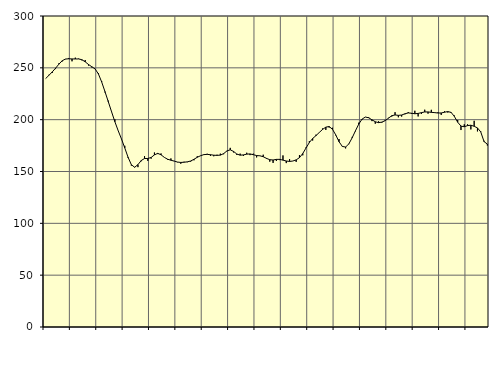
| Category | Piggar | Series 1 |
|---|---|---|
| nan | 239.7 | 239.65 |
| 87.0 | 243.3 | 242.8 |
| 87.0 | 245.1 | 246.07 |
| 87.0 | 248.8 | 249.6 |
| nan | 254.3 | 253.47 |
| 88.0 | 256.1 | 256.8 |
| 88.0 | 258.3 | 258.48 |
| 88.0 | 259.5 | 258.73 |
| nan | 256.3 | 258.58 |
| 89.0 | 259.8 | 258.54 |
| 89.0 | 258.9 | 258.57 |
| 89.0 | 257.2 | 257.83 |
| nan | 257.5 | 255.8 |
| 90.0 | 252.2 | 253.21 |
| 90.0 | 250.4 | 251.1 |
| 90.0 | 249 | 248.9 |
| nan | 244.9 | 244.19 |
| 91.0 | 237.2 | 236.37 |
| 91.0 | 226.3 | 227.07 |
| 91.0 | 218.3 | 217.39 |
| nan | 208 | 207.63 |
| 92.0 | 200.3 | 198.05 |
| 92.0 | 189.3 | 189.4 |
| 92.0 | 181.3 | 181.42 |
| nan | 174.8 | 172.77 |
| 93.0 | 163.1 | 163.76 |
| 93.0 | 155.7 | 156.57 |
| 93.0 | 154.4 | 154.07 |
| nan | 154.2 | 156.63 |
| 94.0 | 159.9 | 160.62 |
| 94.0 | 164.8 | 162.52 |
| 94.0 | 160.3 | 162.56 |
| nan | 162.4 | 163.52 |
| 95.0 | 168.3 | 166.03 |
| 95.0 | 166.8 | 167.49 |
| 95.0 | 167.4 | 166.12 |
| nan | 163.7 | 163.63 |
| 96.0 | 161.3 | 161.84 |
| 96.0 | 162.6 | 160.87 |
| 96.0 | 160.2 | 160.03 |
| nan | 158.9 | 159.11 |
| 97.0 | 157.5 | 158.73 |
| 97.0 | 159.4 | 158.95 |
| 97.0 | 159 | 159.32 |
| nan | 159.6 | 160.12 |
| 98.0 | 160.8 | 161.78 |
| 98.0 | 164.7 | 163.71 |
| 98.0 | 165.1 | 165.22 |
| nan | 166.5 | 166.29 |
| 99.0 | 167.1 | 166.52 |
| 99.0 | 165.1 | 166.19 |
| 99.0 | 164.7 | 165.73 |
| nan | 166.2 | 165.56 |
| 0.0 | 167.2 | 165.79 |
| 0.0 | 166.7 | 167.25 |
| 0.0 | 169.6 | 169.86 |
| nan | 172.8 | 170.91 |
| 1.0 | 168.4 | 169.36 |
| 1.0 | 166 | 166.88 |
| 1.0 | 167.2 | 165.74 |
| nan | 165 | 166.01 |
| 2.0 | 168.1 | 166.73 |
| 2.0 | 165.8 | 166.95 |
| 2.0 | 167.2 | 166.2 |
| nan | 163.6 | 165.4 |
| 3.0 | 165 | 165.14 |
| 3.0 | 166.2 | 164.27 |
| 3.0 | 162.2 | 162.65 |
| nan | 159.5 | 161.38 |
| 4.0 | 158.3 | 161.1 |
| 4.0 | 160.2 | 161.69 |
| 4.0 | 161 | 161.72 |
| nan | 165.5 | 160.95 |
| 5.0 | 158.1 | 160.13 |
| 5.0 | 162 | 159.7 |
| 5.0 | 160.1 | 160.11 |
| nan | 159.3 | 161.24 |
| 6.0 | 165.8 | 163.33 |
| 6.0 | 165.6 | 167.36 |
| 6.0 | 173.3 | 172.71 |
| nan | 179.3 | 177.95 |
| 7.0 | 179.9 | 181.82 |
| 7.0 | 185.5 | 184.58 |
| 7.0 | 187.5 | 187.61 |
| nan | 191.5 | 190.58 |
| 8.0 | 190.1 | 192.79 |
| 8.0 | 192.4 | 193.4 |
| 8.0 | 192.2 | 190.78 |
| nan | 184.9 | 185.36 |
| 9.0 | 181.3 | 178.74 |
| 9.0 | 173.9 | 174.18 |
| 9.0 | 172.3 | 173.58 |
| nan | 176.4 | 176.76 |
| 10.0 | 183.4 | 182.59 |
| 10.0 | 188.8 | 189.38 |
| 10.0 | 197.1 | 195.77 |
| nan | 200.1 | 200.58 |
| 11.0 | 202.6 | 202.54 |
| 11.0 | 202.4 | 201.81 |
| 11.0 | 198.6 | 199.88 |
| nan | 196.1 | 197.98 |
| 12.0 | 198.4 | 197.13 |
| 12.0 | 197.1 | 197.63 |
| 12.0 | 199.8 | 199.04 |
| nan | 201.8 | 201.42 |
| 13.0 | 203 | 203.8 |
| 13.0 | 207.2 | 204.55 |
| 13.0 | 202.3 | 204.16 |
| nan | 203 | 204.48 |
| 14.0 | 205.2 | 205.68 |
| 14.0 | 207.3 | 206.5 |
| 14.0 | 205.6 | 206.19 |
| nan | 208.6 | 205.7 |
| 15.0 | 203.1 | 206.03 |
| 15.0 | 205.5 | 206.77 |
| 15.0 | 209.6 | 207.45 |
| nan | 205.8 | 207.45 |
| 16.0 | 209.5 | 207.05 |
| 16.0 | 207.1 | 206.8 |
| 16.0 | 207.1 | 206.41 |
| nan | 204.6 | 206.47 |
| 17.0 | 208.1 | 207.17 |
| 17.0 | 206.9 | 207.81 |
| 17.0 | 206.5 | 207.03 |
| nan | 204 | 203.1 |
| 18.0 | 199.7 | 197.54 |
| 18.0 | 190 | 193.8 |
| 18.0 | 195.5 | 193.16 |
| nan | 195.5 | 194.27 |
| 19.0 | 190.6 | 194.65 |
| 19.0 | 198.9 | 193.61 |
| 19.0 | 188.7 | 192.04 |
| nan | 188.7 | 188.16 |
| 20.0 | 179.6 | 178.84 |
| 20.0 | 175.1 | 176.43 |